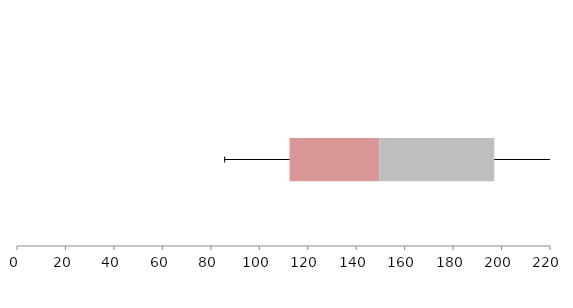
| Category | Series 1 | Series 2 | Series 3 |
|---|---|---|---|
| 0 | 112.508 | 37.046 | 47.443 |